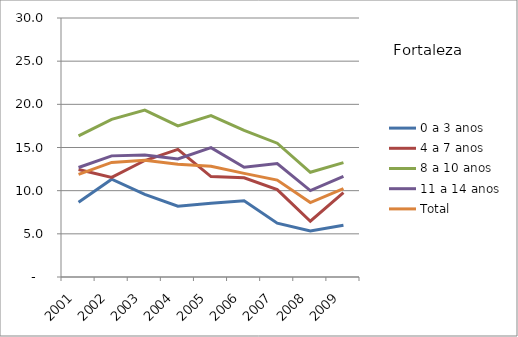
| Category | 0 a 3 anos | 4 a 7 anos | 8 a 10 anos | 11 a 14 anos | Total |
|---|---|---|---|---|---|
| 2001.0 | 8.65 | 12.45 | 16.35 | 12.68 | 11.88 |
| 2002.0 | 11.33 | 11.53 | 18.26 | 14.03 | 13.27 |
| 2003.0 | 9.58 | 13.49 | 19.34 | 14.12 | 13.51 |
| 2004.0 | 8.21 | 14.78 | 17.51 | 13.68 | 13.05 |
| 2005.0 | 8.53 | 11.63 | 18.7 | 14.99 | 12.82 |
| 2006.0 | 8.82 | 11.5 | 16.99 | 12.71 | 12 |
| 2007.0 | 6.24 | 10.13 | 15.5 | 13.14 | 11.23 |
| 2008.0 | 5.32 | 6.46 | 12.13 | 10.01 | 8.62 |
| 2009.0 | 6 | 9.78 | 13.25 | 11.66 | 10.24 |